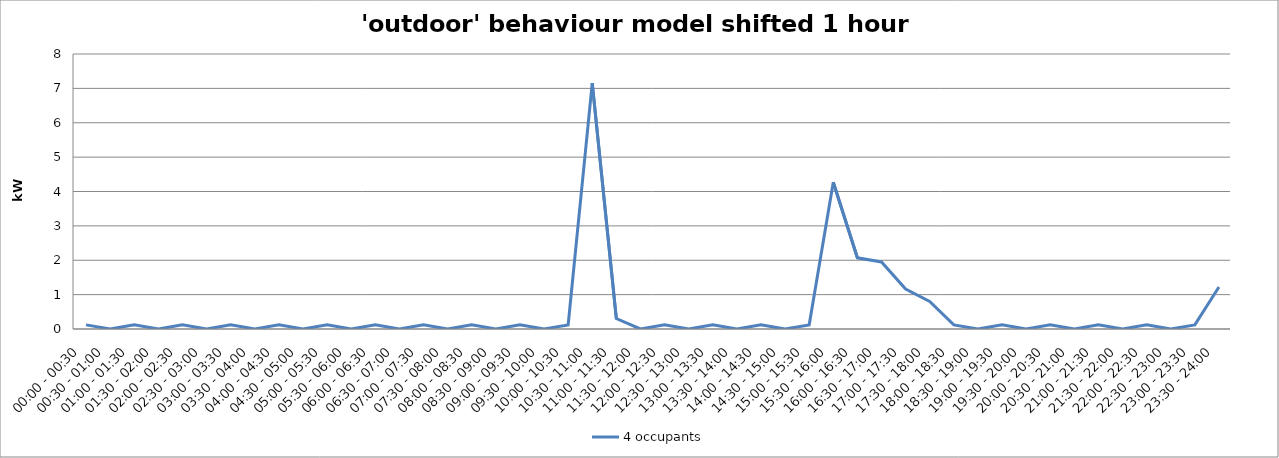
| Category | 4 occupants |
|---|---|
| 00:00 - 00:30 | 0.121 |
| 00:30 - 01:00 | 0 |
| 01:00 - 01:30 | 0.121 |
| 01:30 - 02:00 | 0 |
| 02:00 - 02:30 | 0.121 |
| 02:30 - 03:00 | 0 |
| 03:00 - 03:30 | 0.121 |
| 03:30 - 04:00 | 0 |
| 04:00 - 04:30 | 0.121 |
| 04:30 - 05:00 | 0 |
| 05:00 - 05:30 | 0.121 |
| 05:30 - 06:00 | 0 |
| 06:00 - 06:30 | 0.121 |
| 06:30 - 07:00 | 0 |
| 07:00 - 07:30 | 0.121 |
| 07:30 - 08:00 | 0 |
| 08:00 - 08:30 | 0.121 |
| 08:30 - 09:00 | 0 |
| 09:00 - 09:30 | 0.121 |
| 09:30 - 10:00 | 0 |
| 10:00 - 10:30 | 0.121 |
| 10:30 - 11:00 | 7.152 |
| 11:00 - 11:30 | 0.303 |
| 11:30 - 12:00 | 0 |
| 12:00 - 12:30 | 0.121 |
| 12:30 - 13:00 | 0 |
| 13:00 - 13:30 | 0.121 |
| 13:30 - 14:00 | 0 |
| 14:00 - 14:30 | 0.121 |
| 14:30 - 15:00 | 0 |
| 15:00 - 15:30 | 0.121 |
| 15:30 - 16:00 | 4.27 |
| 16:00 - 16:30 | 2.071 |
| 16:30 - 17:00 | 1.951 |
| 17:00 - 17:30 | 1.161 |
| 17:30 - 18:00 | 0.8 |
| 18:00 - 18:30 | 0.121 |
| 18:30 - 19:00 | 0 |
| 19:00 - 19:30 | 0.121 |
| 19:30 - 20:00 | 0 |
| 20:00 - 20:30 | 0.121 |
| 20:30 - 21:00 | 0 |
| 21:00 - 21:30 | 0.121 |
| 21:30 - 22:00 | 0 |
| 22:00 - 22:30 | 0.121 |
| 22:30 - 23:00 | 0 |
| 23:00 - 23:30 | 0.121 |
| 23:30 - 24:00 | 1.223 |